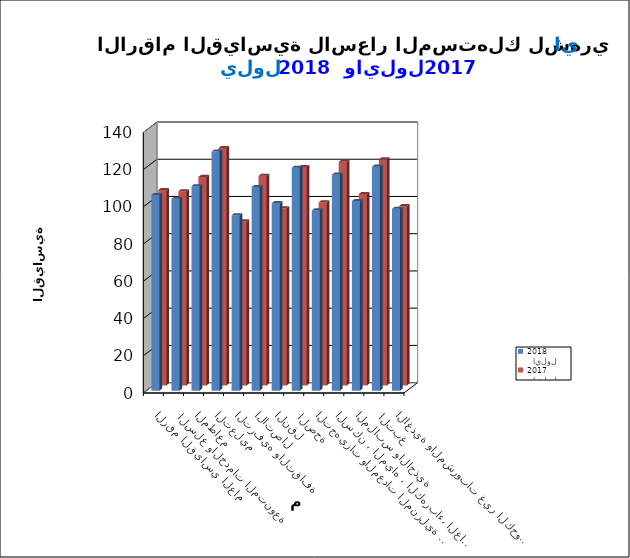
| Category |   ايلول      2018      |   ايلول    2017 |
|---|---|---|
| الاغذية والمشروبات غير الكحولية | 97.7 | 96.3 |
|  التبغ | 120.3 | 121.4 |
| الملابس والاحذية | 101.8 | 102.8 |
| السكن ، المياه ، الكهرباء، الغاز  | 116 | 120.2 |
| التجهيزات والمعدات المنزلية والصيانة | 96.8 | 98.4 |
|  الصحة | 119.7 | 117.3 |
| النقل | 100.7 | 95.2 |
| الاتصال | 109.4 | 112.6 |
| الترفيه والثقافة | 94.2 | 88.1 |
| التعليم | 128.4 | 127.5 |
| المطاعم  | 109.8 | 112 |
|  السلع والخدمات المتنوعة | 103.1 | 104.3 |
| الرقم القياسي العام | 105.1 | 105 |